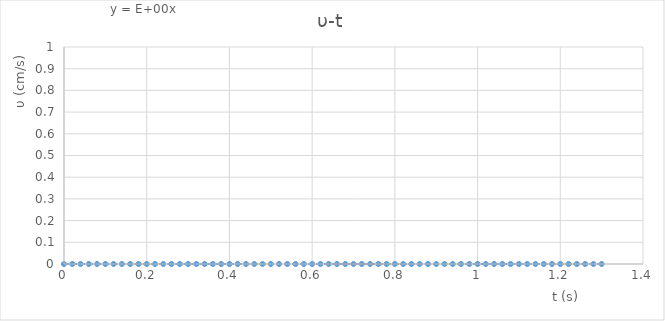
| Category | υ(cm/s) |
|---|---|
| 0.0 | 0 |
| 0.02 | 0 |
| 0.04 | 0 |
| 0.06 | 0 |
| 0.08 | 0 |
| 0.1 | 0 |
| 0.12000000000000001 | 0 |
| 0.14 | 0 |
| 0.16 | 0 |
| 0.18 | 0 |
| 0.19999999999999998 | 0 |
| 0.21999999999999997 | 0 |
| 0.23999999999999996 | 0 |
| 0.25999999999999995 | 0 |
| 0.27999999999999997 | 0 |
| 0.3 | 0 |
| 0.32 | 0 |
| 0.34 | 0 |
| 0.36000000000000004 | 0 |
| 0.38000000000000006 | 0 |
| 0.4000000000000001 | 0 |
| 0.4200000000000001 | 0 |
| 0.4400000000000001 | 0 |
| 0.46000000000000013 | 0 |
| 0.48000000000000015 | 0 |
| 0.5000000000000001 | 0 |
| 0.5200000000000001 | 0 |
| 0.5400000000000001 | 0 |
| 0.5600000000000002 | 0 |
| 0.5800000000000002 | 0 |
| 0.6000000000000002 | 0 |
| 0.6200000000000002 | 0 |
| 0.6400000000000002 | 0 |
| 0.6600000000000003 | 0 |
| 0.6800000000000003 | 0 |
| 0.7000000000000003 | 0 |
| 0.7200000000000003 | 0 |
| 0.7400000000000003 | 0 |
| 0.7600000000000003 | 0 |
| 0.7800000000000004 | 0 |
| 0.8000000000000004 | 0 |
| 0.8200000000000004 | 0 |
| 0.8400000000000004 | 0 |
| 0.8600000000000004 | 0 |
| 0.8800000000000004 | 0 |
| 0.9000000000000005 | 0 |
| 0.9200000000000005 | 0 |
| 0.9400000000000005 | 0 |
| 0.9600000000000005 | 0 |
| 0.9800000000000005 | 0 |
| 1.0000000000000004 | 0 |
| 1.0200000000000005 | 0 |
| 1.0400000000000005 | 0 |
| 1.0600000000000005 | 0 |
| 1.0800000000000005 | 0 |
| 1.1000000000000005 | 0 |
| 1.1200000000000006 | 0 |
| 1.1400000000000006 | 0 |
| 1.1600000000000006 | 0 |
| 1.1800000000000006 | 0 |
| 1.2000000000000006 | 0 |
| 1.2200000000000006 | 0 |
| 1.2400000000000007 | 0 |
| 1.2600000000000007 | 0 |
| 1.2800000000000007 | 0 |
| 1.3000000000000007 | 0 |